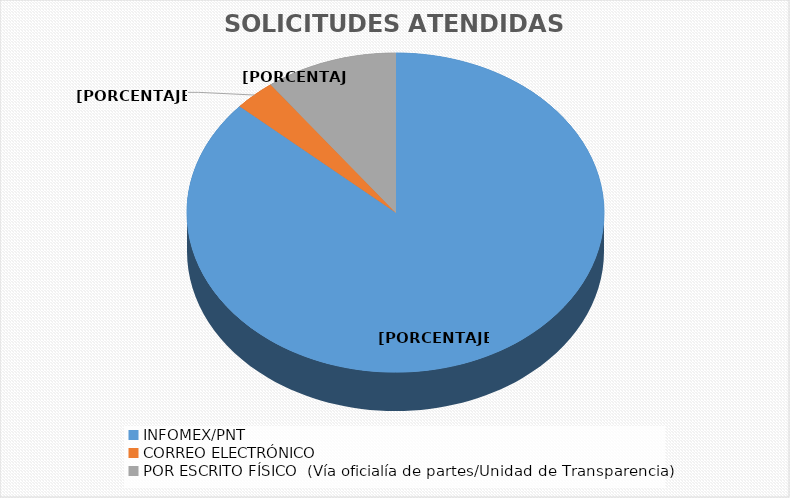
| Category | Series 0 |
|---|---|
| INFOMEX/PNT | 2109 |
| CORREO ELECTRÓNICO | 78 |
| POR ESCRITO FÍSICO  (Vía oficialía de partes/Unidad de Transparencia) | 249 |